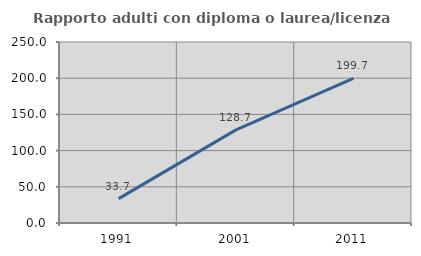
| Category | Rapporto adulti con diploma o laurea/licenza media  |
|---|---|
| 1991.0 | 33.711 |
| 2001.0 | 128.686 |
| 2011.0 | 199.742 |